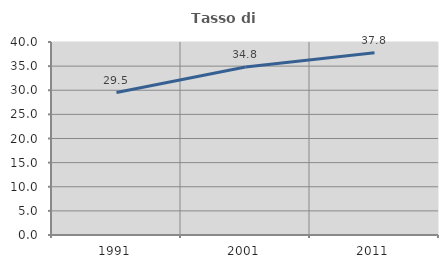
| Category | Tasso di occupazione   |
|---|---|
| 1991.0 | 29.534 |
| 2001.0 | 34.808 |
| 2011.0 | 37.764 |